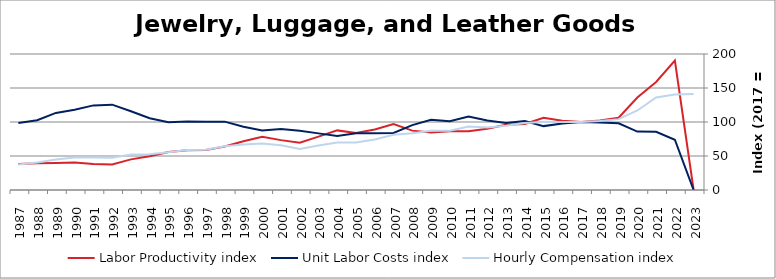
| Category | Labor Productivity index | Unit Labor Costs index | Hourly Compensation index |
|---|---|---|---|
| 2023.0 | 0 | 0 | 141.092 |
| 2022.0 | 190.228 | 73.876 | 140.533 |
| 2021.0 | 158.888 | 85.603 | 136.014 |
| 2020.0 | 136.034 | 85.962 | 116.938 |
| 2019.0 | 106.272 | 98.058 | 104.208 |
| 2018.0 | 102.2 | 99.31 | 101.495 |
| 2017.0 | 100 | 100 | 100 |
| 2016.0 | 101.973 | 97.932 | 99.865 |
| 2015.0 | 106.27 | 93.949 | 99.84 |
| 2014.0 | 97.222 | 101.344 | 98.529 |
| 2013.0 | 95.893 | 98.652 | 94.6 |
| 2012.0 | 89.96 | 102.367 | 92.089 |
| 2011.0 | 86.415 | 107.925 | 93.263 |
| 2010.0 | 86.389 | 101.029 | 87.278 |
| 2009.0 | 84.406 | 103.372 | 87.253 |
| 2008.0 | 87.296 | 95.456 | 83.329 |
| 2007.0 | 96.859 | 83.767 | 81.136 |
| 2006.0 | 88.927 | 83.614 | 74.356 |
| 2005.0 | 83.818 | 83.284 | 69.807 |
| 2004.0 | 87.656 | 79.537 | 69.719 |
| 2003.0 | 78.464 | 83.275 | 65.341 |
| 2002.0 | 69.556 | 86.97 | 60.493 |
| 2001.0 | 73.336 | 89.696 | 65.78 |
| 2000.0 | 78.236 | 87.435 | 68.406 |
| 1999.0 | 71.781 | 93.149 | 66.864 |
| 1998.0 | 63.911 | 100.529 | 64.249 |
| 1997.0 | 58.908 | 100.453 | 59.175 |
| 1996.0 | 58.417 | 100.698 | 58.825 |
| 1995.0 | 55.754 | 99.695 | 55.584 |
| 1994.0 | 49.771 | 105.477 | 52.497 |
| 1993.0 | 45.034 | 115.821 | 52.159 |
| 1992.0 | 37.684 | 125.529 | 47.304 |
| 1991.0 | 38.309 | 124.44 | 47.672 |
| 1990.0 | 40.377 | 118.024 | 47.655 |
| 1989.0 | 39.588 | 113.33 | 44.865 |
| 1988.0 | 39.342 | 102.695 | 40.402 |
| 1987.0 | 38.259 | 98.366 | 37.634 |